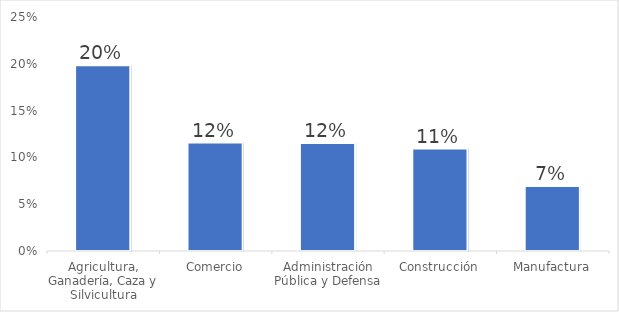
| Category | Series 0 |
|---|---|
| Agricultura, Ganadería, Caza y Silvicultura | 0.199 |
| Comercio | 0.116 |
| Administración Pública y Defensa | 0.115 |
| Construcción | 0.109 |
| Manufactura | 0.069 |